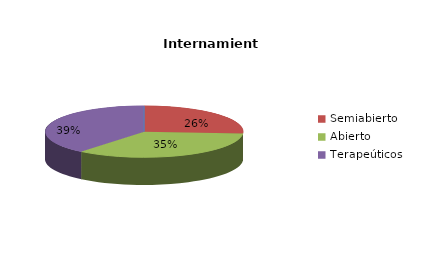
| Category | Series 0 |
|---|---|
| Cerrado | 0 |
| Semiabierto | 6 |
| Abierto | 8 |
| Terapeúticos | 9 |